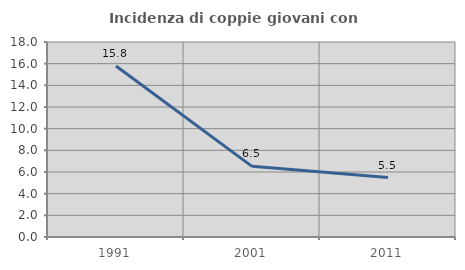
| Category | Incidenza di coppie giovani con figli |
|---|---|
| 1991.0 | 15.789 |
| 2001.0 | 6.522 |
| 2011.0 | 5.486 |